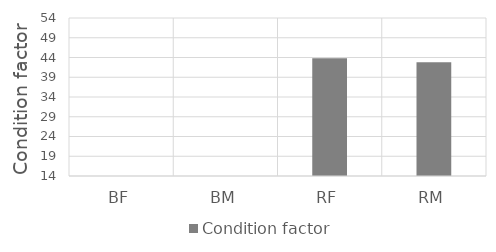
| Category | Condition factor |
|---|---|
| BF | 0 |
| BM | 0 |
| RF | 43.8 |
| RM | 42.8 |